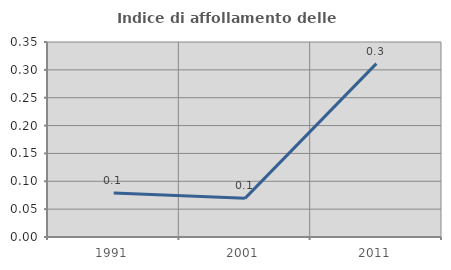
| Category | Indice di affollamento delle abitazioni  |
|---|---|
| 1991.0 | 0.079 |
| 2001.0 | 0.069 |
| 2011.0 | 0.311 |